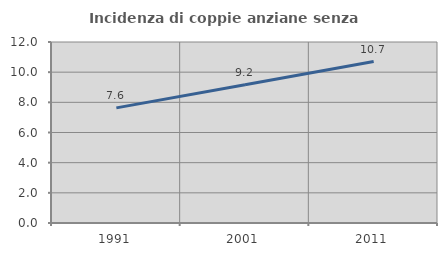
| Category | Incidenza di coppie anziane senza figli  |
|---|---|
| 1991.0 | 7.632 |
| 2001.0 | 9.172 |
| 2011.0 | 10.704 |